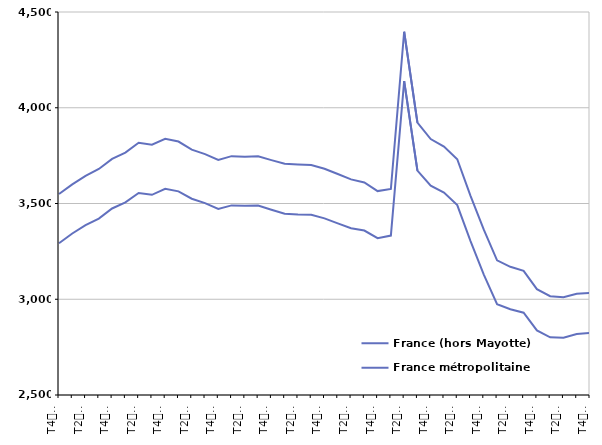
| Category | France (hors Mayotte) | France métropolitaine |
|---|---|---|
| T4
2013 | 3549.3 | 3292.2 |
| T1
2014 | 3599.8 | 3343.3 |
| T2
2014 | 3644.7 | 3386.6 |
| T3
2014 | 3680.5 | 3421.2 |
| T4
2014 | 3733.2 | 3474 |
| T1
2015 | 3765.7 | 3505.6 |
| T2
2015 | 3817.2 | 3554.7 |
| T3
2015 | 3807.4 | 3545.5 |
| T4
2015 | 3837.4 | 3576.9 |
| T1
2016 | 3823.5 | 3563.5 |
| T2
2016 | 3780.9 | 3525 |
| T3
2016 | 3757.9 | 3502.3 |
| T4
2016 | 3727.6 | 3471.3 |
| T1
2017 | 3747.3 | 3490.1 |
| T2
2017 | 3744.7 | 3488.7 |
| T3
2017 | 3746.4 | 3489.5 |
| T4
2017 | 3726.6 | 3467.4 |
| T1
2018 | 3707.2 | 3446.8 |
| T2
2018 | 3703.5 | 3442.6 |
| T3
2018 | 3701 | 3440.7 |
| T4
2018 | 3681.3 | 3422.4 |
| T1
2019 | 3653.9 | 3396 |
| T2
2019 | 3625.8 | 3371 |
| T3
2019 | 3609.8 | 3358.7 |
| T4
2019 | 3564.7 | 3318.7 |
| T1
2020 | 3575.7 | 3332.6 |
| T2
2020 | 4396.8 | 4139 |
| T3
2020 | 3922.1 | 3672.1 |
| T4
2020 | 3836.5 | 3593.4 |
| T1
2021 | 3797.6 | 3557 |
| T2
2021 | 3731 | 3491.8 |
| T3
2021 | 3539.9 | 3303.9 |
| T4
2021 | 3363.3 | 3128.8 |
| T1
2022 | 3203.4 | 2974.4 |
| T2
2022 | 3169.5 | 2947.7 |
| T3
2022 | 3148.5 | 2929.9 |
| T4
2022 | 3052.7 | 2837 |
| T1
2023 | 3016 | 2801.4 |
| T2
2023 | 3011.1 | 2799.5 |
| T3
2023 | 3028.5 | 2818.8 |
| T4
2023 | 3033.3 | 2824.4 |